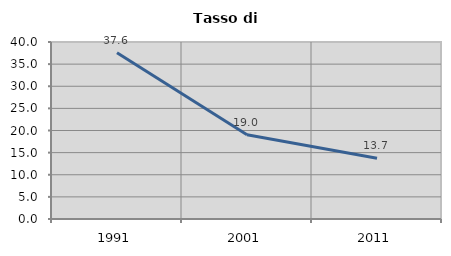
| Category | Tasso di disoccupazione   |
|---|---|
| 1991.0 | 37.552 |
| 2001.0 | 19.045 |
| 2011.0 | 13.734 |